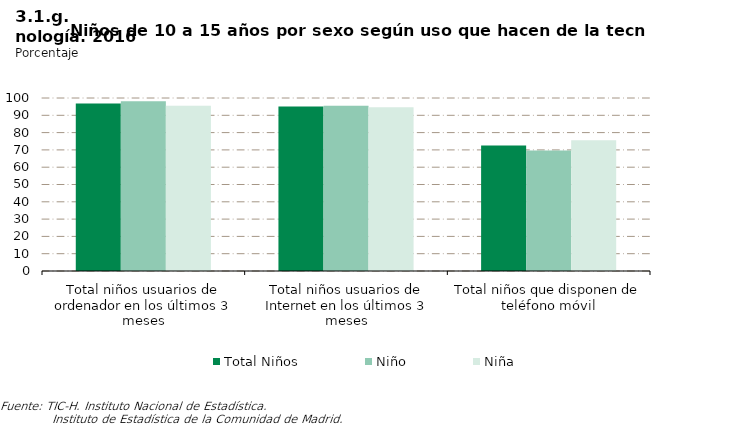
| Category | Total Niños | Niño | Niña |
|---|---|---|---|
| Total niños usuarios de ordenador en los últimos 3 meses | 96.852 | 98.081 | 95.56 |
| Total niños usuarios de Internet en los últimos 3 meses | 95.101 | 95.591 | 94.586 |
| Total niños que disponen de teléfono móvil | 72.58 | 69.668 | 75.643 |